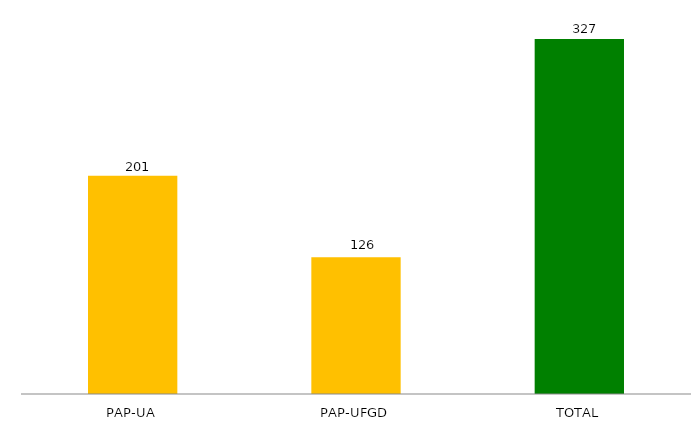
| Category | Series 1 |
|---|---|
| PAP-UA | 201 |
| PAP-UFGD | 126 |
| TOTAL | 327 |